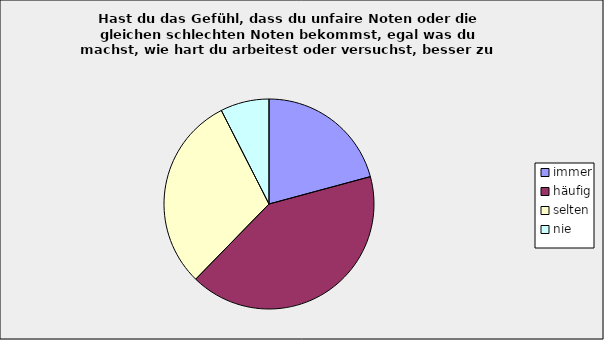
| Category | Series 0 |
|---|---|
| immer | 0.208 |
| häufig | 0.415 |
| selten | 0.302 |
| nie | 0.075 |